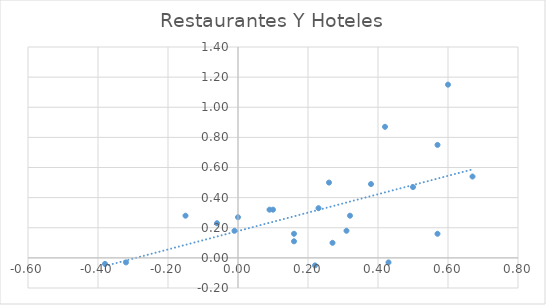
| Category | Restaurantes Y Hoteles |
|---|---|
| 0.38 | 0.49 |
| -0.15 | 0.28 |
| -0.06 | 0.23 |
| 0.32 | 0.28 |
| -0.01 | 0.18 |
| 0.0 | 0.27 |
| -0.38 | -0.04 |
| -0.32 | -0.03 |
| 0.16 | 0.16 |
| 0.57 | 0.16 |
| 0.67 | 0.54 |
| 0.42 | 0.87 |
| 0.26 | 0.5 |
| 0.1 | 0.32 |
| 0.16 | 0.11 |
| 0.23 | 0.33 |
| 0.09 | 0.32 |
| 0.22 | -0.05 |
| 0.27 | 0.1 |
| 0.31 | 0.18 |
| 0.5 | 0.47 |
| 0.43 | -0.03 |
| 0.57 | 0.75 |
| 0.6 | 1.15 |